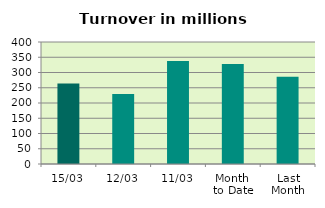
| Category | Series 0 |
|---|---|
| 15/03 | 263.757 |
| 12/03 | 229.859 |
| 11/03 | 337.895 |
| Month 
to Date | 328.262 |
| Last
Month | 285.972 |